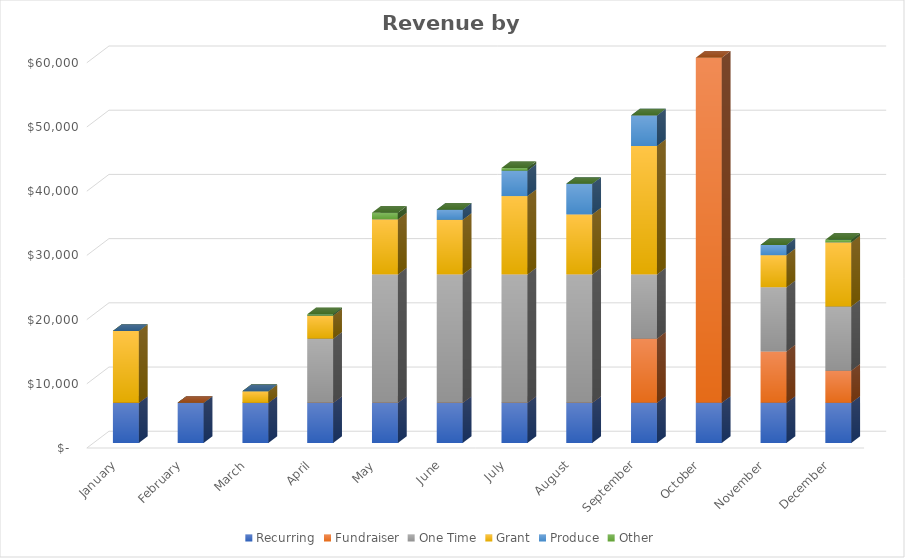
| Category | Recurring | Fundraiser | One Time | Grant | Produce | Other |
|---|---|---|---|---|---|---|
| January | 6250 | 0 | 0 | 11200 | 0 | 0 |
| February | 6250 | 0 | 0 | 0 | 0 | 0 |
| March | 6250 | 0 | 0 | 1800 | 0 | 0 |
| April | 6250 | 0 | 10000 | 3600 | 0 | 200 |
| May | 6250 | 0 | 20000 | 8600 | 0 | 1000 |
| June | 6250 | 0 | 20000 | 8500 | 1585.562 | 0 |
| July | 6250 | 0 | 20000 | 12200 | 3963.906 | 400 |
| August | 6250 | 0 | 20000 | 9350 | 4756.687 | 0 |
| September | 6250 | 10000 | 10000 | 20000 | 4756.687 | 0 |
| October | 6250 | 127000 | 10000 | 10000 | 3171.125 | 0 |
| November | 6250 | 8000 | 10000 | 5000 | 1585.562 | 0 |
| December | 6250 | 5000 | 10000 | 10000 | 0 | 400 |